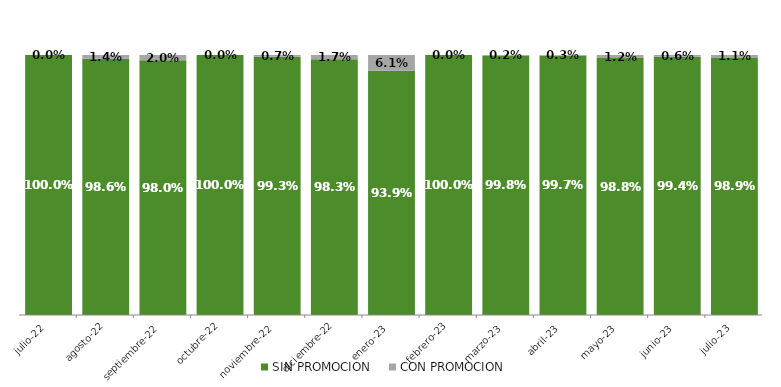
| Category | SIN PROMOCION   | CON PROMOCION   |
|---|---|---|
| 2022-07-01 | 1 | 0 |
| 2022-08-01 | 0.986 | 0.014 |
| 2022-09-01 | 0.98 | 0.02 |
| 2022-10-01 | 1 | 0 |
| 2022-11-01 | 0.993 | 0.007 |
| 2022-12-01 | 0.983 | 0.017 |
| 2023-01-01 | 0.939 | 0.061 |
| 2023-02-01 | 1 | 0 |
| 2023-03-01 | 0.998 | 0.002 |
| 2023-04-01 | 0.997 | 0.003 |
| 2023-05-01 | 0.988 | 0.012 |
| 2023-06-01 | 0.994 | 0.006 |
| 2023-07-01 | 0.989 | 0.011 |